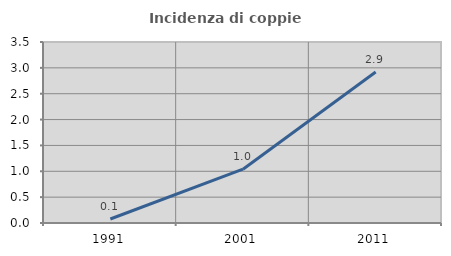
| Category | Incidenza di coppie miste |
|---|---|
| 1991.0 | 0.077 |
| 2001.0 | 1.04 |
| 2011.0 | 2.92 |